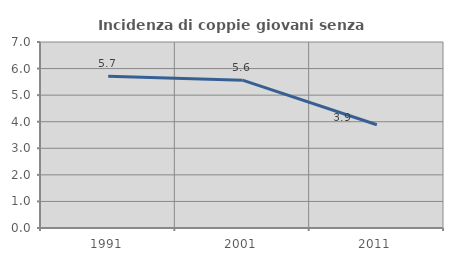
| Category | Incidenza di coppie giovani senza figli |
|---|---|
| 1991.0 | 5.714 |
| 2001.0 | 5.564 |
| 2011.0 | 3.885 |